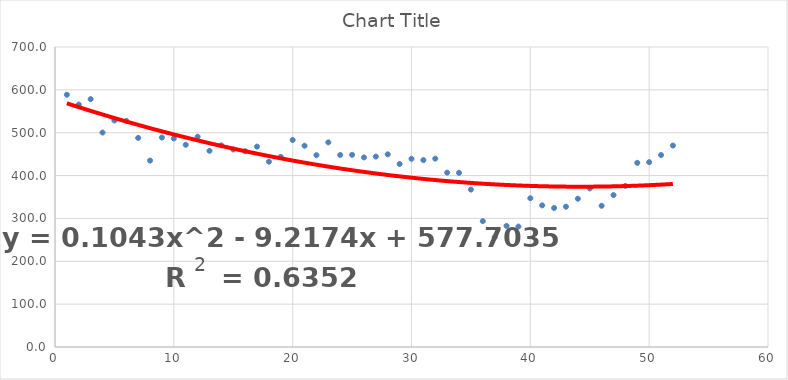
| Category | Series 0 |
|---|---|
| 1.0 | 588.6 |
| 2.0 | 565.8 |
| 3.0 | 578.4 |
| 4.0 | 500.4 |
| 5.0 | 528.5 |
| 6.0 | 527.5 |
| 7.0 | 487.8 |
| 8.0 | 434.9 |
| 9.0 | 488.7 |
| 10.0 | 486.6 |
| 11.0 | 471.8 |
| 12.0 | 490.7 |
| 13.0 | 457.8 |
| 14.0 | 470.5 |
| 15.0 | 460.9 |
| 16.0 | 456.7 |
| 17.0 | 467.6 |
| 18.0 | 432.4 |
| 19.0 | 443.7 |
| 20.0 | 483 |
| 21.0 | 469.6 |
| 22.0 | 447.6 |
| 23.0 | 477.5 |
| 24.0 | 448.1 |
| 25.0 | 448.4 |
| 26.0 | 442.4 |
| 27.0 | 444.3 |
| 28.0 | 449.6 |
| 29.0 | 427.1 |
| 30.0 | 439.2 |
| 31.0 | 436.1 |
| 32.0 | 439.5 |
| 33.0 | 406.9 |
| 34.0 | 406.3 |
| 35.0 | 367.3 |
| 36.0 | 293.7 |
| 37.0 | 256 |
| 38.0 | 282.6 |
| 39.0 | 281 |
| 40.0 | 347.1 |
| 41.0 | 330.5 |
| 42.0 | 324.4 |
| 43.0 | 327.3 |
| 44.0 | 345.9 |
| 45.0 | 370 |
| 46.0 | 329.5 |
| 47.0 | 354.4 |
| 48.0 | 375.9 |
| 49.0 | 429.7 |
| 50.0 | 431.3 |
| 51.0 | 447.9 |
| 52.0 | 470 |